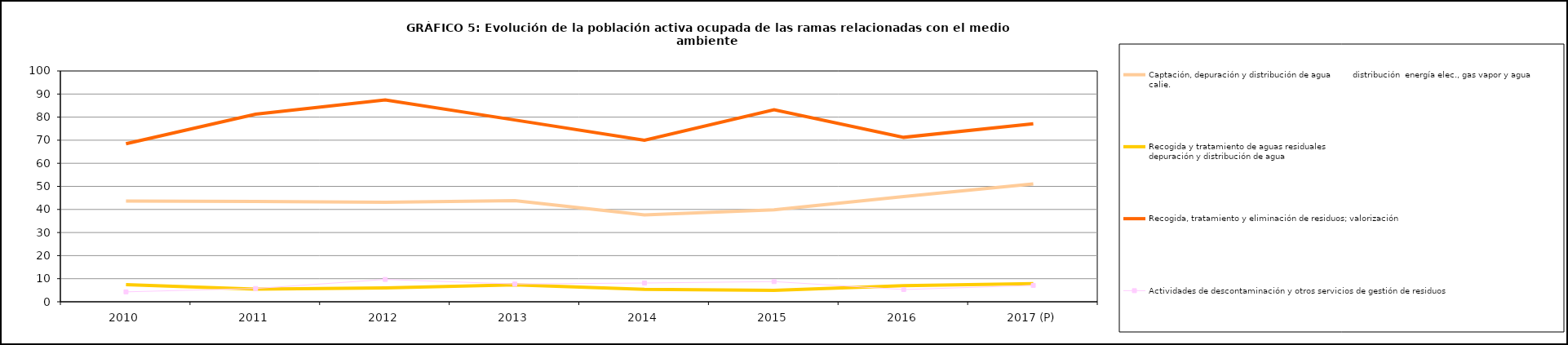
| Category | Captación, depuración y distribución de agua         | Recogida y tratamiento de aguas residuales                                                                                 | Recogida, tratamiento y eliminación de residuos; valorización       | Actividades de descontaminación y otros servicios de gestión de residuos  |
|---|---|---|---|---|
| 2010 | 43.675 | 7.425 | 68.45 | 4.3 |
| 2011 | 43.425 | 5.5 | 81.275 | 5.75 |
| 2012 | 43.1 | 6.05 | 87.45 | 9.675 |
| 2013 | 43.8 | 7.3 | 78.75 | 7.7 |
| 2014 | 37.675 | 5.35 | 70 | 8.125 |
| 2015 | 39.85 | 4.975 | 83.225 | 8.75 |
| 2016 | 45.6 | 7 | 71.25 | 5.3 |
| 2017 (P) | 51.1 | 7.9 | 77.1 | 7.1 |